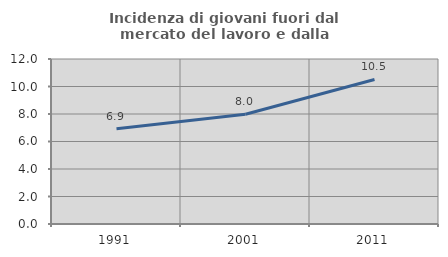
| Category | Incidenza di giovani fuori dal mercato del lavoro e dalla formazione  |
|---|---|
| 1991.0 | 6.929 |
| 2001.0 | 7.984 |
| 2011.0 | 10.511 |